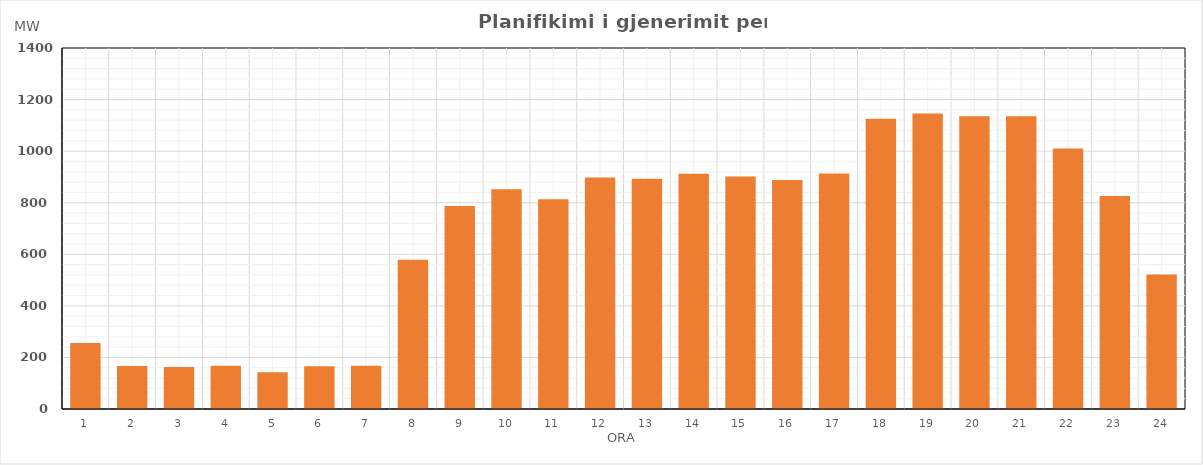
| Category | Max (MW) |
|---|---|
| 0 | 255.83 |
| 1 | 166.309 |
| 2 | 163.304 |
| 3 | 167.319 |
| 4 | 142.244 |
| 5 | 166.128 |
| 6 | 167.867 |
| 7 | 578.798 |
| 8 | 787.029 |
| 9 | 851.941 |
| 10 | 813.278 |
| 11 | 897.437 |
| 12 | 893.337 |
| 13 | 912.542 |
| 14 | 901.769 |
| 15 | 888.226 |
| 16 | 913.282 |
| 17 | 1125.215 |
| 18 | 1146.044 |
| 19 | 1134.919 |
| 20 | 1135.034 |
| 21 | 1009.81 |
| 22 | 825.84 |
| 23 | 522.015 |